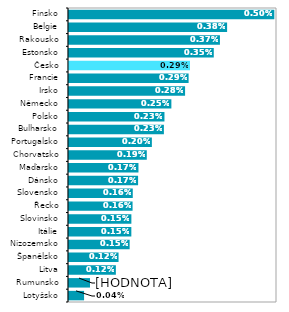
| Category | Series 0 |
|---|---|
| Lotyšsko | 0 |
| Rumunsko | 0.001 |
| Litva | 0.001 |
| Španělsko | 0.001 |
| Nizozemsko | 0.001 |
| Itálie | 0.002 |
| Slovinsko | 0.002 |
| Řecko | 0.002 |
| Slovensko | 0.002 |
| Dánsko | 0.002 |
| Maďarsko | 0.002 |
| Chorvatsko | 0.002 |
| Portugalsko | 0.002 |
| Bulharsko | 0.002 |
| Polsko | 0.002 |
| Německo | 0.002 |
| Irsko | 0.003 |
| Francie | 0.003 |
| Česko | 0.003 |
| Estonsko | 0.004 |
| Rakousko | 0.004 |
| Belgie | 0.004 |
| Finsko | 0.005 |